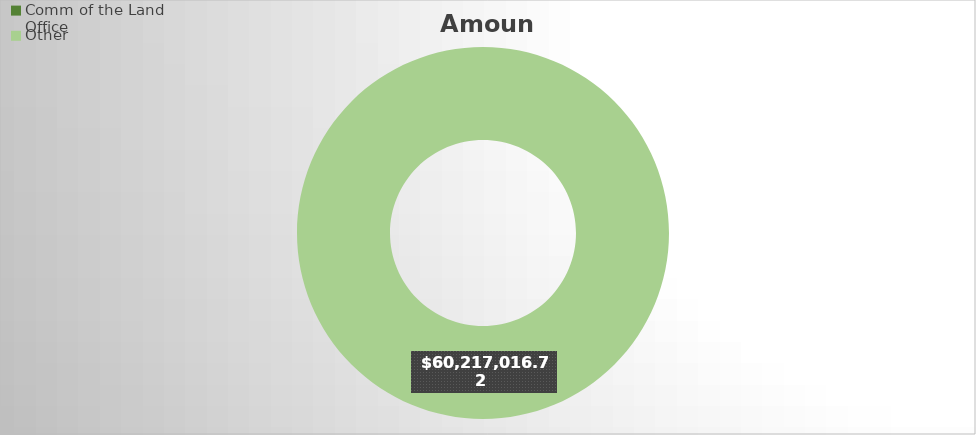
| Category | Amount |
|---|---|
| Comm of the Land Office | 0 |
| Other | 60217016.72 |